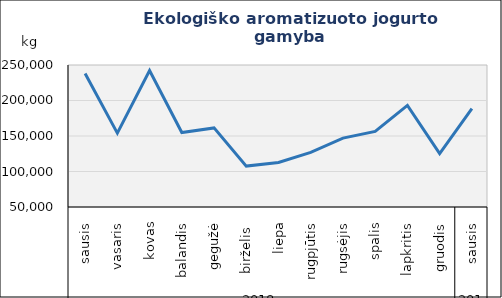
| Category | Aromatizuotas jogurtas |
|---|---|
| 0 | 238141 |
| 1 | 154066 |
| 2 | 242074 |
| 3 | 154895 |
| 4 | 161407 |
| 5 | 107590 |
| 6 | 112625 |
| 7 | 126970 |
| 8 | 146980 |
| 9 | 156460 |
| 10 | 193043 |
| 11 | 125298 |
| 12 | 188627 |